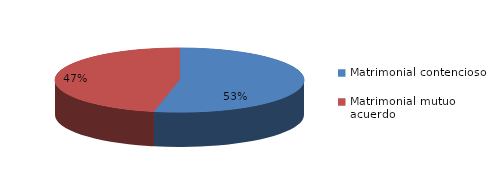
| Category | Series 0 |
|---|---|
| 0 | 1849 |
| 1 | 1621 |